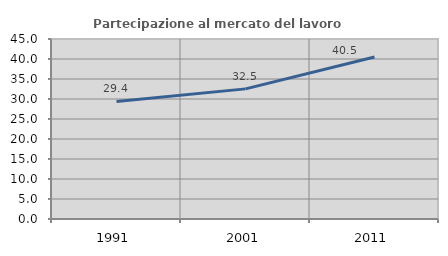
| Category | Partecipazione al mercato del lavoro  femminile |
|---|---|
| 1991.0 | 29.379 |
| 2001.0 | 32.53 |
| 2011.0 | 40.491 |